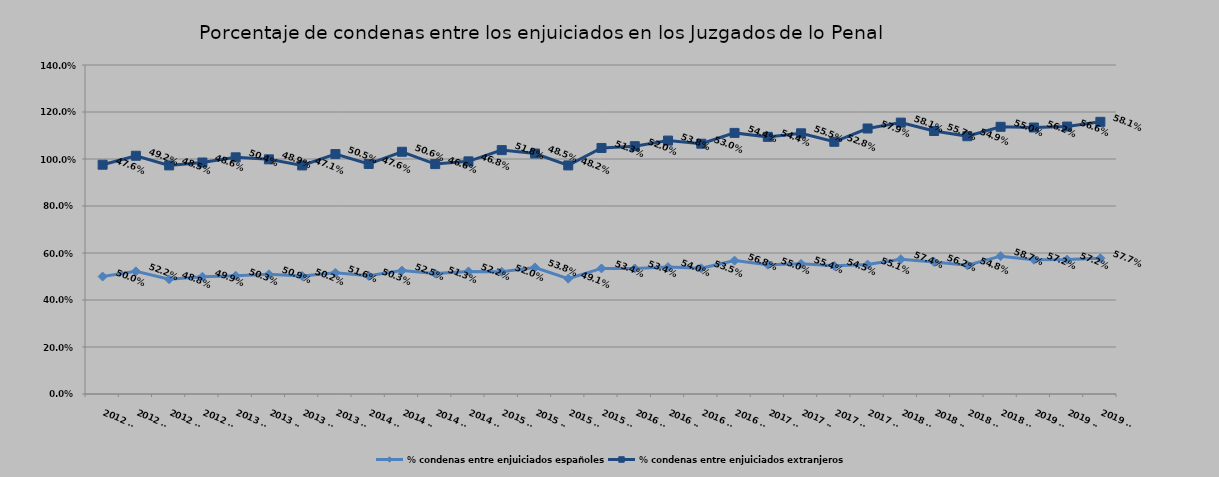
| Category | % condenas entre enjuiciados españoles | % condenas entre enjuiciados extranjeros |
|---|---|---|
| 2012 T1 | 0.5 | 0.476 |
| 2012 T2 | 0.522 | 0.492 |
| 2012 T3 | 0.488 | 0.485 |
| 2012 T4 | 0.499 | 0.486 |
| 2013 T1 | 0.503 | 0.504 |
| 2013 T2 | 0.509 | 0.489 |
| 2013 T3 | 0.502 | 0.471 |
| 2013 T4 | 0.516 | 0.505 |
| 2014 T1 | 0.503 | 0.476 |
| 2014 T2 | 0.525 | 0.506 |
| 2014 T3 | 0.513 | 0.466 |
| 2014 T4 | 0.522 | 0.468 |
| 2015 T1 | 0.52 | 0.518 |
| 2015 T2 | 0.538 | 0.485 |
| 2015 T3 | 0.491 | 0.482 |
| 2015 T4 | 0.534 | 0.513 |
| 2016 T1 | 0.534 | 0.52 |
| 2016 T2 | 0.54 | 0.538 |
| 2016 T3 | 0.535 | 0.53 |
| 2016 T4 | 0.568 | 0.544 |
| 2017 T1 | 0.55 | 0.544 |
| 2017 T2 | 0.554 | 0.555 |
| 2017 T3 | 0.545 | 0.528 |
| 2017 T4 | 0.551 | 0.579 |
| 2018 T1 | 0.574 | 0.581 |
| 2018 T2 | 0.562 | 0.557 |
| 2018 T3 | 0.548 | 0.549 |
| 2018 T4 | 0.587 | 0.55 |
| 2019 T1 | 0.572 | 0.562 |
| 2019 T2 | 0.572 | 0.566 |
| 2019 T3 | 0.577 | 0.581 |